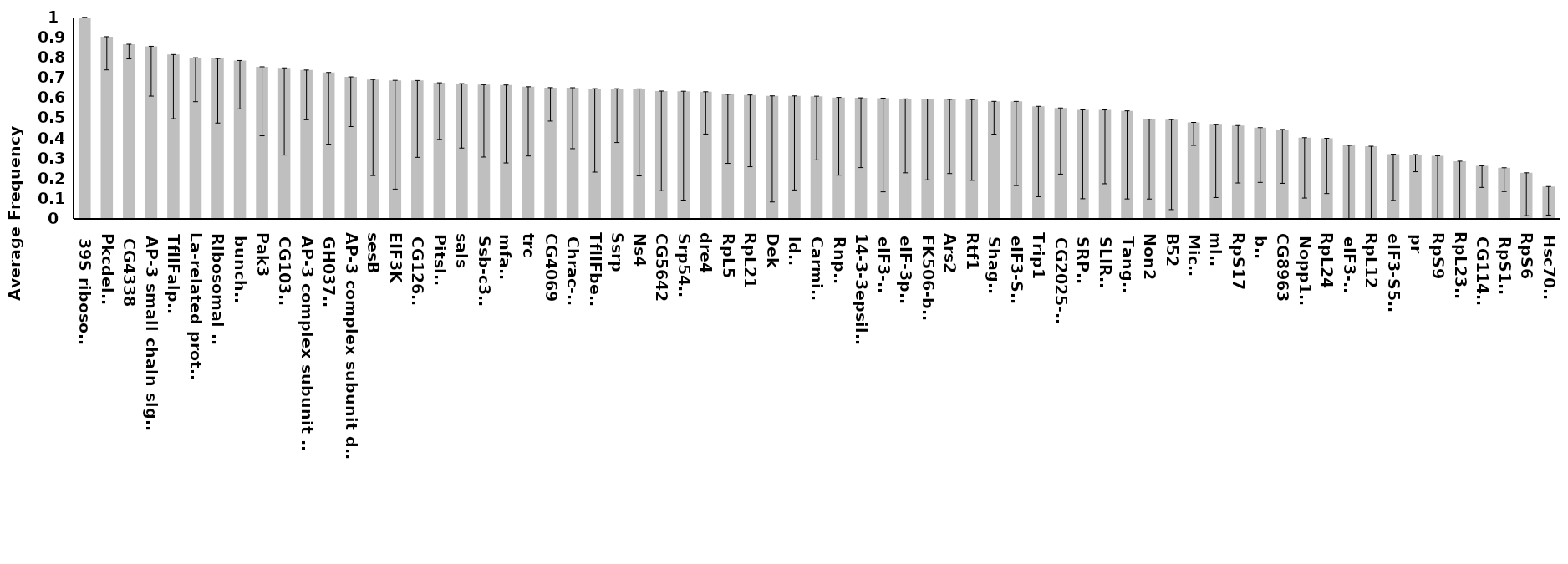
| Category | Series 0 |
|---|---|
| 39S ribosomal | 1 |
| Pkcdelta | 0.905 |
|  CG4338 | 0.867 |
| AP-3 small chain sigma3 | 0.857 |
| TfIIFalpha | 0.816 |
| La-related protein | 0.8 |
| Ribosomal L1 | 0.796 |
| bunched | 0.787 |
| Pak3 | 0.755 |
| CG10341 | 0.75 |
| AP-3 complex subunit beta | 0.739 |
| GH03795 | 0.727 |
| AP-3 complex subunit delta | 0.705 |
| sesB | 0.692 |
| EIF3K | 0.688 |
| CG12608 | 0.687 |
| Pitslre | 0.676 |
| sals | 0.672 |
| Ssb-c31a | 0.667 |
| mfas  | 0.665 |
| trc | 0.656 |
| CG4069 | 0.652 |
| Chrac-14 | 0.652 |
| TfIIFbeta | 0.647 |
| Ssrp | 0.647 |
| Ns4 | 0.646 |
| CG5642 | 0.635 |
| Srp54k  | 0.634 |
| dre4 | 0.631 |
| RpL5 | 0.619 |
| RpL21 | 0.615 |
| Dek | 0.611 |
| ldbr | 0.611 |
| Carmine | 0.609 |
| Rnp4F | 0.603 |
| 14-3-3epsilon | 0.601 |
| eIF3-S9 | 0.6 |
| eIF-3p40 | 0.596 |
| FK506-bp1 | 0.595 |
| Ars2 | 0.594 |
| Rtf1 | 0.592 |
| Shaggy | 0.584 |
| eIF3-S10 | 0.584 |
| Trip1 | 0.559 |
| CG2025-RA | 0.551 |
| SRP72 | 0.542 |
| SLIRP1 | 0.541 |
| Tango7 | 0.537 |
| Non2 | 0.495 |
| B52 | 0.493 |
| Mical | 0.479 |
| mil  | 0.468 |
| RpS17 | 0.464 |
| bsf | 0.453 |
| CG8963 | 0.444 |
| Nopp140 | 0.403 |
| RpL24 | 0.4 |
| eIF3-S6 | 0.365 |
| RpL12 | 0.361 |
| eIF3-S5-1 | 0.321 |
| pr | 0.32 |
| RpS9 | 0.314 |
| RpL23A | 0.287 |
| CG11444 | 0.264 |
| RpS19a | 0.254 |
| RpS6 | 0.229 |
| Hsc70-4 | 0.161 |